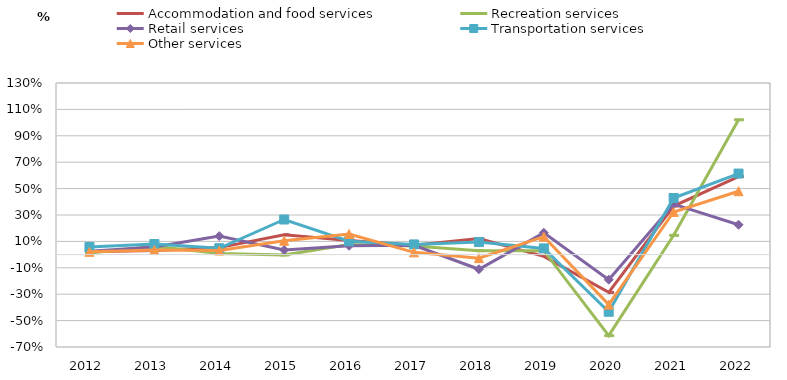
| Category | Accommodation and food services | Recreation services | Retail services | Transportation services | Other services |
|---|---|---|---|---|---|
| 2012.0 | 0.021 | 0.013 | 0.026 | 0.058 | 0.021 |
| 2013.0 | 0.031 | 0.063 | 0.058 | 0.08 | 0.035 |
| 2014.0 | 0.053 | 0.008 | 0.14 | 0.048 | 0.031 |
| 2015.0 | 0.15 | -0.003 | 0.035 | 0.266 | 0.105 |
| 2016.0 | 0.107 | 0.076 | 0.067 | 0.101 | 0.156 |
| 2017.0 | 0.071 | 0.065 | 0.07 | 0.077 | 0.017 |
| 2018.0 | 0.121 | 0.03 | -0.111 | 0.095 | -0.027 |
| 2019.0 | -0.013 | 0.03 | 0.165 | 0.047 | 0.136 |
| 2020.0 | -0.286 | -0.614 | -0.19 | -0.433 | -0.379 |
| 2021.0 | 0.368 | 0.146 | 0.382 | 0.429 | 0.323 |
| 2022.0 | 0.591 | 1.021 | 0.226 | 0.614 | 0.48 |